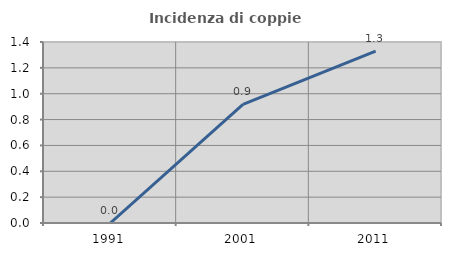
| Category | Incidenza di coppie miste |
|---|---|
| 1991.0 | 0 |
| 2001.0 | 0.917 |
| 2011.0 | 1.33 |